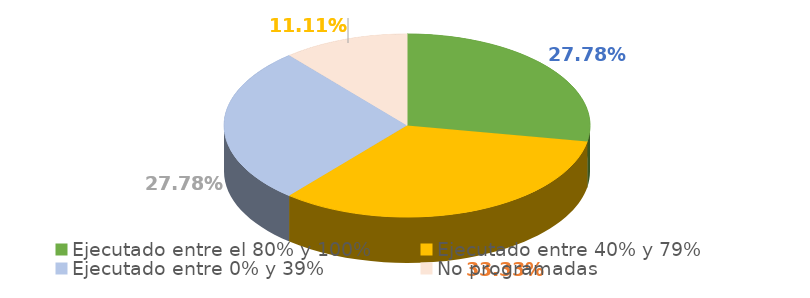
| Category | Series 0 |
|---|---|
| Ejecutado entre el 80% y 100% | 0.278 |
| Ejecutado entre 40% y 79% | 0.333 |
| Ejecutado entre 0% y 39% | 0.278 |
| No programadas | 0.111 |